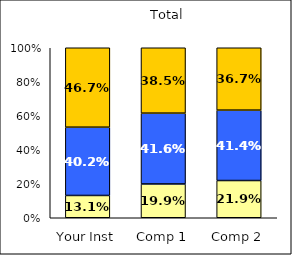
| Category | Low Negative Cross-Racial Interaction | Average Negative Cross-Racial Interaction | High Negative Cross-Racial Interaction |
|---|---|---|---|
| Your Inst | 0.131 | 0.402 | 0.467 |
| Comp 1 | 0.199 | 0.416 | 0.385 |
| Comp 2 | 0.219 | 0.414 | 0.367 |